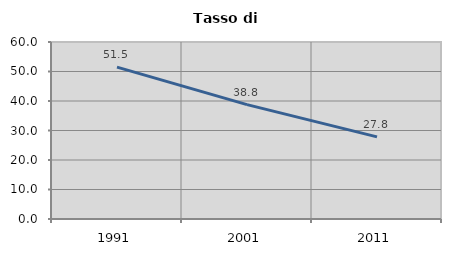
| Category | Tasso di disoccupazione   |
|---|---|
| 1991.0 | 51.486 |
| 2001.0 | 38.777 |
| 2011.0 | 27.829 |